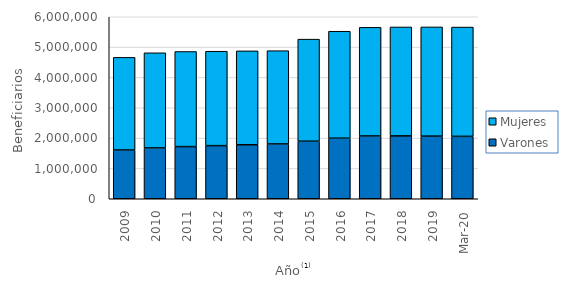
| Category | Varones | Mujeres |
|---|---|---|
| 2009.0 | 1608093 | 3053553 |
| 2010.0 | 1676437 | 3135528 |
| 2011.0 | 1719085 | 3135345 |
| 2012.0 | 1751268 | 3112657 |
| 2013.0 | 1780170 | 3095022 |
| 2014.0 | 1807154 | 3074924 |
| 2015.0 | 1896819 | 3365514 |
| 2016.0 | 1996921 | 3525765 |
| 2017.0 | 2069873 | 3581816 |
| 2018.0 | 2073619 | 3589778 |
| 2019.0 | 2064637 | 3600519 |
| 43891.0 | 2057173 | 3603577 |